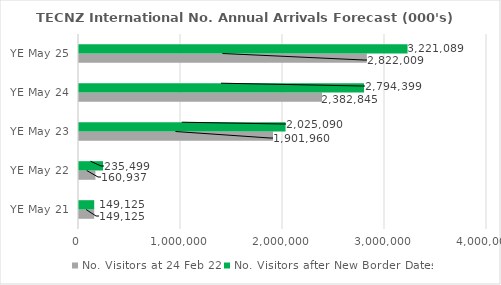
| Category | No. Visitors at 24 Feb 22 | No. Visitors after New Border Dates |
|---|---|---|
| YE May 21 | 149125 | 149125 |
| YE May 22 | 160937 | 235499.3 |
| YE May 23 | 1901960 | 2025090.35 |
| YE May 24 | 2382844.9 | 2794399.3 |
| YE May 25 | 2822009.05 | 3221089.4 |